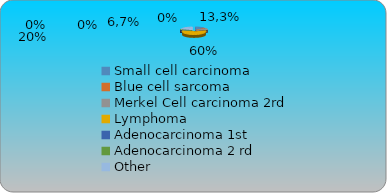
| Category | Series 0 | Series 1 | Series 2 | Series 3 |
|---|---|---|---|---|
| Small cell carcinoma | 0.133 |  |  |  |
| Blue cell sarcoma | 0 |  |  |  |
| Merkel Cell carcinoma 2rd | 0.067 |  |  |  |
| Lymphoma | 0.6 |  |  |  |
| Adenocarcinoma 1st | 0 |  |  |  |
| Adenocarcinoma 2 rd | 0 |  |  |  |
| Other | 0.2 |  |  |  |